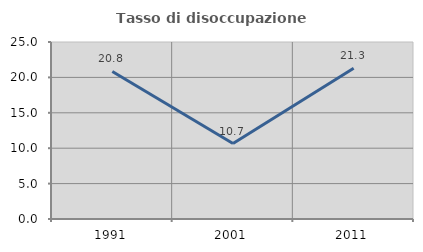
| Category | Tasso di disoccupazione giovanile  |
|---|---|
| 1991.0 | 20.843 |
| 2001.0 | 10.664 |
| 2011.0 | 21.286 |